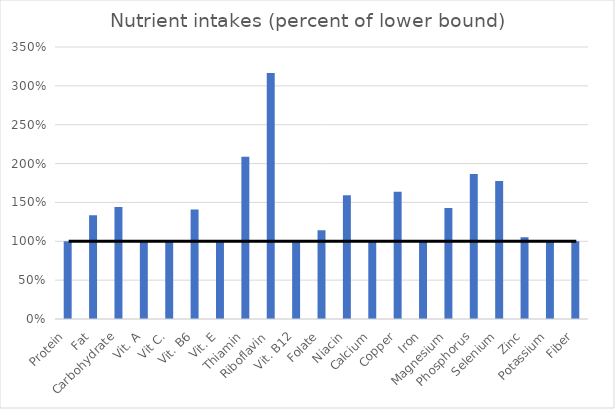
| Category | Series 0 |
|---|---|
| 0 | 1 |
| 1 | 1.336 |
| 2 | 1.443 |
| 3 | 1 |
| 4 | 1 |
| 5 | 1.409 |
| 6 | 1 |
| 7 | 2.088 |
| 8 | 3.167 |
| 9 | 1 |
| 10 | 1.142 |
| 11 | 1.592 |
| 12 | 1 |
| 13 | 1.636 |
| 14 | 1 |
| 15 | 1.428 |
| 16 | 1.864 |
| 17 | 1.776 |
| 18 | 1.052 |
| 19 | 1 |
| 20 | 1 |